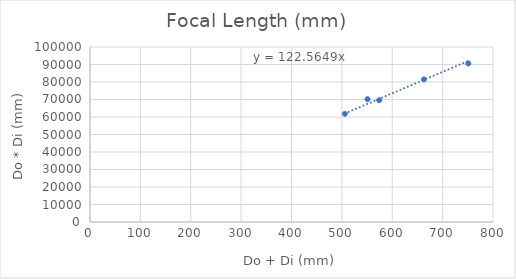
| Category | Do * Di (mm) |
|---|---|
| 551.0 | 70200 |
| 506.0 | 61800 |
| 574.0 | 69600 |
| 663.0 | 81500 |
| 751.0 | 90600 |